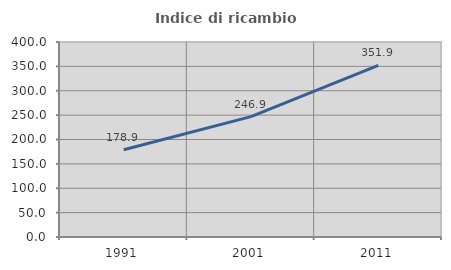
| Category | Indice di ricambio occupazionale  |
|---|---|
| 1991.0 | 178.891 |
| 2001.0 | 246.864 |
| 2011.0 | 351.877 |